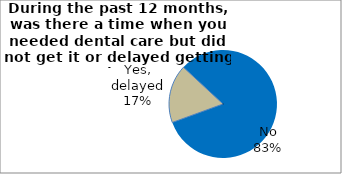
| Category | Series 0 |
|---|---|
| Yes, delayed | 17.469 |
| No | 82.531 |